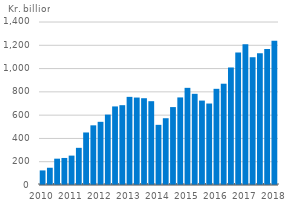
| Category | International investment position |
|---|---|
| 2010.0 | 125.22 |
| nan | 148.188 |
| nan | 226.132 |
| nan | 232.256 |
| 2011.0 | 252.458 |
| nan | 319.261 |
| nan | 451.187 |
| nan | 512.523 |
| 2012.0 | 542.657 |
| nan | 604.702 |
| nan | 674.825 |
| nan | 685.518 |
| 2013.0 | 757.008 |
| nan | 751.086 |
| nan | 745.321 |
| nan | 719.851 |
| 2014.0 | 516.755 |
| nan | 573.508 |
| nan | 669.161 |
| nan | 752.135 |
| 2015.0 | 834.477 |
| nan | 783.194 |
| nan | 725.122 |
| nan | 699.787 |
| 2016.0 | 826.151 |
| nan | 869.937 |
| nan | 1009.391 |
| nan | 1137.839 |
| 2017.0 | 1208.749 |
| nan | 1097.415 |
| nan | 1132.239 |
| nan | 1168.148 |
| 2018.0 | 1238.866 |